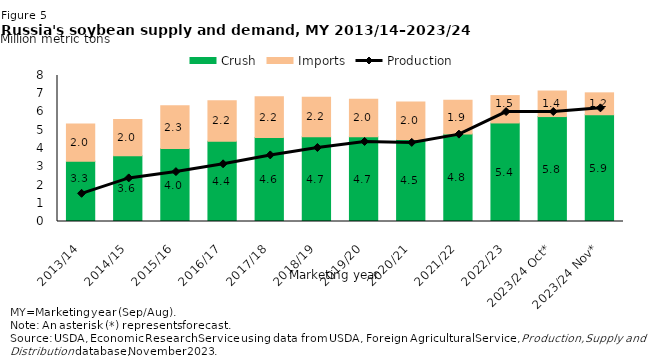
| Category | Crush | Imports |
|---|---|---|
| 2013/14 | 3.3 | 2.048 |
| 2014/15 | 3.6 | 1.986 |
| 2015/16 | 4 | 2.336 |
| 2016/17 | 4.4 | 2.221 |
| 2017/18 | 4.6 | 2.237 |
| 2018/19 | 4.65 | 2.162 |
| 2019/20 | 4.65 | 2.047 |
| 2020/21 | 4.5 | 2.042 |
| 2021/22 | 4.8 | 1.85 |
| 2022/23 | 5.4 | 1.5 |
| 2023/24 Oct* | 5.75 | 1.4 |
| 2023/24 Nov* | 5.85 | 1.2 |